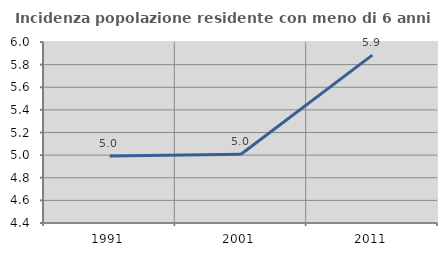
| Category | Incidenza popolazione residente con meno di 6 anni |
|---|---|
| 1991.0 | 4.993 |
| 2001.0 | 5.008 |
| 2011.0 | 5.884 |